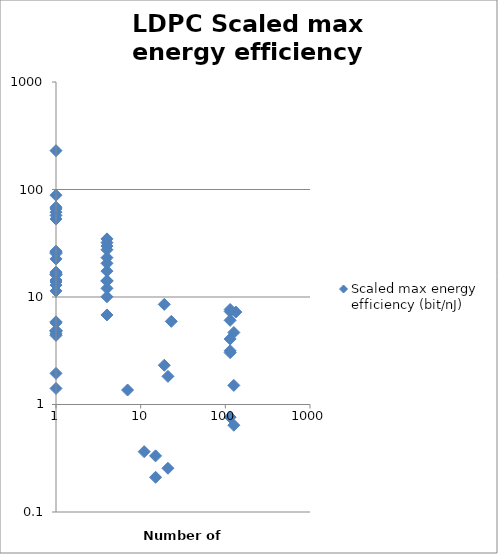
| Category | Scaled max energy efficiency (bit/nJ) |
|---|---|
| 107.0 | 0 |
| 114.0 | 7.335 |
| 19.0 | 8.538 |
| 133.0 | 7.243 |
| 114.0 | 0.763 |
| 7.0 | 1.364 |
| 12.0 | 0 |
| 114.0 | 0 |
| 114.0 | 0 |
| 11.0 | 0 |
| 11.0 | 0 |
| 11.0 | 0 |
| 21.0 | 1.827 |
| 11.0 | 0 |
| 11.0 | 0.364 |
| 5.0 | 0 |
| 21.0 | 0.255 |
| 15.0 | 0.333 |
| 15.0 | 0.21 |
| 21.0 | 0 |
| 11.0 | 0 |
| 5.0 | 0 |
| 1.0 | 0 |
| 12.0 | 0 |
| 1.0 | 0 |
| 114.0 | 6.067 |
| 126.0 | 1.505 |
| 126.0 | 0.641 |
| 126.0 | 4.676 |
| 1.0 | 13.771 |
| 126.0 | 0 |
| 1.0 | 0 |
| 114.0 | 0 |
| 19.0 | 2.317 |
| 1.0 | 4.391 |
| 1.0 | 22.607 |
| 1.0 | 16.165 |
| 1.0 | 16.711 |
| 1.0 | 12.909 |
| 1.0 | 16.136 |
| 1.0 | 1.947 |
| 1.0 | 5.879 |
| 1.0 | 4.849 |
| 1.0 | 4.885 |
| 1.0 | 4.543 |
| 1.0 | 4.766 |
| 1.0 | 0 |
| 1.0 | 0 |
| 1.0 | 0 |
| 1.0 | 0 |
| 1.0 | 0 |
| 1.0 | 65.999 |
| 4.0 | 20.568 |
| 4.0 | 0 |
| 4.0 | 12.035 |
| 4.0 | 14.218 |
| 4.0 | 6.808 |
| 4.0 | 10.051 |
| 1.0 | 0 |
| 4.0 | 32.058 |
| 1.0 | 88.496 |
| 1.0 | 53.191 |
| 114.0 | 0 |
| 12.0 | 0 |
| 23.0 | 5.931 |
| 114.0 | 3.037 |
| 114.0 | 4.071 |
| 1.0 | 26.686 |
| 1.0 | 25.42 |
| 1.0 | 68.497 |
| 1.0 | 17.036 |
| 1.0 | 14.376 |
| 6.0 | 0 |
| 114.0 | 3.16 |
| 114.0 | 7.649 |
| 4.0 | 34.746 |
| 4.0 | 27.54 |
| 1.0 | 1.41 |
| 12.0 | 0 |
| 1.0 | 5.748 |
| 4.0 | 29.792 |
| 4.0 | 14.034 |
| 4.0 | 23.214 |
| 1.0 | 11.388 |
| 1.0 | 26.1 |
| 1.0 | 57.449 |
| 1.0 | 61.519 |
| 4.0 | 17.405 |
| 1.0 | 229.994 |